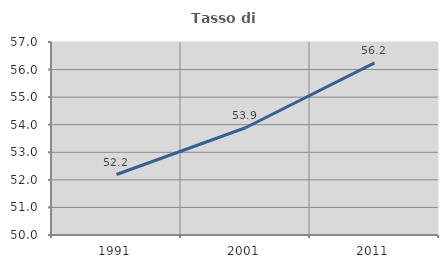
| Category | Tasso di occupazione   |
|---|---|
| 1991.0 | 52.193 |
| 2001.0 | 53.889 |
| 2011.0 | 56.244 |